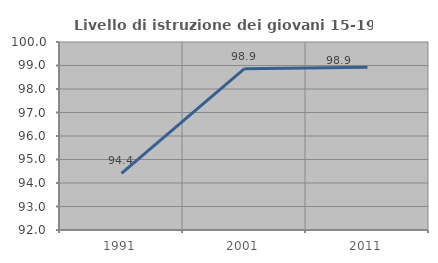
| Category | Livello di istruzione dei giovani 15-19 anni |
|---|---|
| 1991.0 | 94.406 |
| 2001.0 | 98.864 |
| 2011.0 | 98.925 |